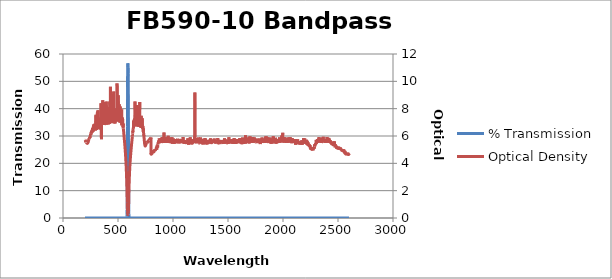
| Category | % Transmission |
|---|---|
| 2600.0 | 0.002 |
| 2599.0 | 0.002 |
| 2598.0 | 0.002 |
| 2597.0 | 0.002 |
| 2596.0 | 0.003 |
| 2595.0 | 0.002 |
| 2594.0 | 0.002 |
| 2593.0 | 0.002 |
| 2592.0 | 0.002 |
| 2591.0 | 0.002 |
| 2590.0 | 0.002 |
| 2589.0 | 0.002 |
| 2588.0 | 0.002 |
| 2587.0 | 0.003 |
| 2586.0 | 0.002 |
| 2585.0 | 0.002 |
| 2584.0 | 0.002 |
| 2583.0 | 0.002 |
| 2582.0 | 0.002 |
| 2581.0 | 0.002 |
| 2580.0 | 0.002 |
| 2579.0 | 0.002 |
| 2578.0 | 0.002 |
| 2577.0 | 0.002 |
| 2576.0 | 0.002 |
| 2575.0 | 0.002 |
| 2574.0 | 0.002 |
| 2573.0 | 0.002 |
| 2572.0 | 0.002 |
| 2571.0 | 0.002 |
| 2570.0 | 0.002 |
| 2569.0 | 0.002 |
| 2568.0 | 0.002 |
| 2567.0 | 0.002 |
| 2566.0 | 0.002 |
| 2565.0 | 0.002 |
| 2564.0 | 0.002 |
| 2563.0 | 0.001 |
| 2562.0 | 0.002 |
| 2561.0 | 0.001 |
| 2560.0 | 0.002 |
| 2559.0 | 0.002 |
| 2558.0 | 0.002 |
| 2557.0 | 0.001 |
| 2556.0 | 0.001 |
| 2555.0 | 0.001 |
| 2554.0 | 0.001 |
| 2553.0 | 0.002 |
| 2552.0 | 0.001 |
| 2551.0 | 0.001 |
| 2550.0 | 0.001 |
| 2549.0 | 0.001 |
| 2548.0 | 0.001 |
| 2547.0 | 0.001 |
| 2546.0 | 0.001 |
| 2545.0 | 0.001 |
| 2544.0 | 0.001 |
| 2543.0 | 0.001 |
| 2542.0 | 0.001 |
| 2541.0 | 0.001 |
| 2540.0 | 0.001 |
| 2539.0 | 0.001 |
| 2538.0 | 0.001 |
| 2537.0 | 0.001 |
| 2536.0 | 0.001 |
| 2535.0 | 0.001 |
| 2534.0 | 0.001 |
| 2533.0 | 0.001 |
| 2532.0 | 0.001 |
| 2531.0 | 0.001 |
| 2530.0 | 0.001 |
| 2529.0 | 0.001 |
| 2528.0 | 0.001 |
| 2527.0 | 0.001 |
| 2526.0 | 0.001 |
| 2525.0 | 0.001 |
| 2524.0 | 0.001 |
| 2523.0 | 0.001 |
| 2522.0 | 0.001 |
| 2521.0 | 0.001 |
| 2520.0 | 0.001 |
| 2519.0 | 0.001 |
| 2518.0 | 0.001 |
| 2517.0 | 0.001 |
| 2516.0 | 0.001 |
| 2515.0 | 0.001 |
| 2514.0 | 0.001 |
| 2513.0 | 0.001 |
| 2512.0 | 0.001 |
| 2511.0 | 0.001 |
| 2510.0 | 0.001 |
| 2509.0 | 0.001 |
| 2508.0 | 0.001 |
| 2507.0 | 0.001 |
| 2506.0 | 0.001 |
| 2505.0 | 0.001 |
| 2504.0 | 0.001 |
| 2503.0 | 0.001 |
| 2502.0 | 0.001 |
| 2501.0 | 0.001 |
| 2500.0 | 0.001 |
| 2499.0 | 0.001 |
| 2498.0 | 0.001 |
| 2497.0 | 0.001 |
| 2496.0 | 0.001 |
| 2495.0 | 0.001 |
| 2494.0 | 0.001 |
| 2493.0 | 0.001 |
| 2492.0 | 0.001 |
| 2491.0 | 0.001 |
| 2490.0 | 0.001 |
| 2489.0 | 0.001 |
| 2488.0 | 0.001 |
| 2487.0 | 0.001 |
| 2486.0 | 0.001 |
| 2485.0 | 0.001 |
| 2484.0 | 0.001 |
| 2483.0 | 0.001 |
| 2482.0 | 0.001 |
| 2481.0 | 0 |
| 2480.0 | 0 |
| 2479.0 | 0 |
| 2478.0 | 0.001 |
| 2477.0 | 0.001 |
| 2476.0 | 0 |
| 2475.0 | 0 |
| 2474.0 | 0.001 |
| 2473.0 | 0.001 |
| 2472.0 | 0 |
| 2471.0 | 0 |
| 2470.0 | 0.001 |
| 2469.0 | 0 |
| 2468.0 | 0 |
| 2467.0 | 0 |
| 2466.0 | 0.001 |
| 2465.0 | 0.001 |
| 2464.0 | 0 |
| 2463.0 | 0.001 |
| 2462.0 | 0 |
| 2461.0 | 0 |
| 2460.0 | 0 |
| 2459.0 | 0 |
| 2458.0 | 0 |
| 2457.0 | 0 |
| 2456.0 | 0 |
| 2455.0 | 0 |
| 2454.0 | 0 |
| 2453.0 | 0 |
| 2452.0 | 0 |
| 2451.0 | 0 |
| 2450.0 | 0 |
| 2449.0 | 0 |
| 2448.0 | 0 |
| 2447.0 | 0 |
| 2446.0 | 0 |
| 2445.0 | 0 |
| 2444.0 | 0 |
| 2443.0 | 0 |
| 2442.0 | 0 |
| 2441.0 | 0 |
| 2440.0 | 0 |
| 2439.0 | 0 |
| 2438.0 | 0 |
| 2437.0 | 0 |
| 2436.0 | 0 |
| 2435.0 | 0 |
| 2434.0 | 0 |
| 2433.0 | 0 |
| 2432.0 | 0 |
| 2431.0 | 0 |
| 2430.0 | 0 |
| 2429.0 | 0 |
| 2428.0 | 0 |
| 2427.0 | 0 |
| 2426.0 | 0 |
| 2425.0 | 0 |
| 2424.0 | 0 |
| 2423.0 | 0 |
| 2422.0 | 0 |
| 2421.0 | 0 |
| 2420.0 | 0 |
| 2419.0 | 0 |
| 2418.0 | 0 |
| 2417.0 | 0 |
| 2416.0 | 0 |
| 2415.0 | 0 |
| 2414.0 | 0 |
| 2413.0 | 0 |
| 2412.0 | 0 |
| 2411.0 | 0 |
| 2410.0 | 0 |
| 2409.0 | 0 |
| 2408.0 | 0 |
| 2407.0 | 0 |
| 2406.0 | 0 |
| 2405.0 | 0 |
| 2404.0 | 0 |
| 2403.0 | 0 |
| 2402.0 | 0 |
| 2401.0 | 0 |
| 2400.0 | 0 |
| 2399.0 | 0 |
| 2398.0 | 0 |
| 2397.0 | 0 |
| 2396.0 | 0 |
| 2395.0 | 0 |
| 2394.0 | 0 |
| 2393.0 | 0 |
| 2392.0 | 0 |
| 2391.0 | 0 |
| 2390.0 | 0 |
| 2389.0 | 0 |
| 2388.0 | 0 |
| 2387.0 | 0 |
| 2386.0 | 0 |
| 2385.0 | 0 |
| 2384.0 | 0 |
| 2383.0 | 0 |
| 2382.0 | 0 |
| 2381.0 | 0 |
| 2380.0 | 0 |
| 2379.0 | 0 |
| 2378.0 | 0 |
| 2377.0 | 0 |
| 2376.0 | 0 |
| 2375.0 | 0 |
| 2374.0 | 0 |
| 2373.0 | 0 |
| 2372.0 | 0 |
| 2371.0 | 0 |
| 2370.0 | 0 |
| 2369.0 | 0 |
| 2368.0 | 0 |
| 2367.0 | 0 |
| 2366.0 | 0 |
| 2365.0 | 0 |
| 2364.0 | 0 |
| 2363.0 | 0 |
| 2362.0 | 0 |
| 2361.0 | 0 |
| 2360.0 | 0 |
| 2359.0 | 0 |
| 2358.0 | 0 |
| 2357.0 | 0 |
| 2356.0 | 0 |
| 2355.0 | 0 |
| 2354.0 | 0 |
| 2353.0 | 0 |
| 2352.0 | 0 |
| 2351.0 | 0 |
| 2350.0 | 0 |
| 2349.0 | 0 |
| 2348.0 | 0 |
| 2347.0 | 0 |
| 2346.0 | 0 |
| 2345.0 | 0 |
| 2344.0 | 0 |
| 2343.0 | 0 |
| 2342.0 | 0 |
| 2341.0 | 0 |
| 2340.0 | 0 |
| 2339.0 | 0 |
| 2338.0 | 0 |
| 2337.0 | 0 |
| 2336.0 | 0 |
| 2335.0 | 0 |
| 2334.0 | 0 |
| 2333.0 | 0 |
| 2332.0 | 0 |
| 2331.0 | 0 |
| 2330.0 | 0 |
| 2329.0 | 0 |
| 2328.0 | 0 |
| 2327.0 | 0 |
| 2326.0 | 0 |
| 2325.0 | 0 |
| 2324.0 | 0 |
| 2323.0 | 0 |
| 2322.0 | 0 |
| 2321.0 | 0 |
| 2320.0 | 0 |
| 2319.0 | 0 |
| 2318.0 | 0 |
| 2317.0 | 0 |
| 2316.0 | 0 |
| 2315.0 | 0 |
| 2314.0 | 0 |
| 2313.0 | 0 |
| 2312.0 | 0 |
| 2311.0 | 0 |
| 2310.0 | 0 |
| 2309.0 | 0 |
| 2308.0 | 0 |
| 2307.0 | 0 |
| 2306.0 | 0 |
| 2305.0 | 0 |
| 2304.0 | 0 |
| 2303.0 | 0 |
| 2302.0 | 0 |
| 2301.0 | 0 |
| 2300.0 | 0 |
| 2299.0 | 0 |
| 2298.0 | 0 |
| 2297.0 | 0 |
| 2296.0 | 0 |
| 2295.0 | 0 |
| 2294.0 | 0 |
| 2293.0 | 0 |
| 2292.0 | 0 |
| 2291.0 | 0.001 |
| 2290.0 | 0.001 |
| 2289.0 | 0.001 |
| 2288.0 | 0 |
| 2287.0 | 0 |
| 2286.0 | 0.001 |
| 2285.0 | 0.001 |
| 2284.0 | 0.001 |
| 2283.0 | 0.001 |
| 2282.0 | 0.001 |
| 2281.0 | 0.001 |
| 2280.0 | 0.001 |
| 2279.0 | 0.001 |
| 2278.0 | 0.001 |
| 2277.0 | 0.001 |
| 2276.0 | 0.001 |
| 2275.0 | 0.001 |
| 2274.0 | 0.001 |
| 2273.0 | 0.001 |
| 2272.0 | 0.001 |
| 2271.0 | 0.001 |
| 2270.0 | 0.001 |
| 2269.0 | 0.001 |
| 2268.0 | 0.001 |
| 2267.0 | 0.001 |
| 2266.0 | 0.001 |
| 2265.0 | 0.001 |
| 2264.0 | 0.001 |
| 2263.0 | 0.001 |
| 2262.0 | 0.001 |
| 2261.0 | 0.001 |
| 2260.0 | 0.001 |
| 2259.0 | 0.001 |
| 2258.0 | 0.001 |
| 2257.0 | 0.001 |
| 2256.0 | 0.001 |
| 2255.0 | 0.001 |
| 2254.0 | 0.001 |
| 2253.0 | 0.001 |
| 2252.0 | 0.001 |
| 2251.0 | 0.001 |
| 2250.0 | 0.001 |
| 2249.0 | 0.001 |
| 2248.0 | 0.001 |
| 2247.0 | 0.001 |
| 2246.0 | 0 |
| 2245.0 | 0.001 |
| 2244.0 | 0.001 |
| 2243.0 | 0 |
| 2242.0 | 0.001 |
| 2241.0 | 0.001 |
| 2240.0 | 0 |
| 2239.0 | 0.001 |
| 2238.0 | 0 |
| 2237.0 | 0 |
| 2236.0 | 0 |
| 2235.0 | 0 |
| 2234.0 | 0 |
| 2233.0 | 0 |
| 2232.0 | 0 |
| 2231.0 | 0 |
| 2230.0 | 0 |
| 2229.0 | 0 |
| 2228.0 | 0 |
| 2227.0 | 0 |
| 2226.0 | 0 |
| 2225.0 | 0 |
| 2224.0 | 0 |
| 2223.0 | 0 |
| 2222.0 | 0 |
| 2221.0 | 0 |
| 2220.0 | 0 |
| 2219.0 | 0 |
| 2218.0 | 0 |
| 2217.0 | 0 |
| 2216.0 | 0 |
| 2215.0 | 0 |
| 2214.0 | 0 |
| 2213.0 | 0 |
| 2212.0 | 0 |
| 2211.0 | 0 |
| 2210.0 | 0 |
| 2209.0 | 0 |
| 2208.0 | 0 |
| 2207.0 | 0 |
| 2206.0 | 0 |
| 2205.0 | 0 |
| 2204.0 | 0 |
| 2203.0 | 0 |
| 2202.0 | 0 |
| 2201.0 | 0 |
| 2200.0 | 0 |
| 2199.0 | 0 |
| 2198.0 | 0 |
| 2197.0 | 0 |
| 2196.0 | 0 |
| 2195.0 | 0 |
| 2194.0 | 0 |
| 2193.0 | 0 |
| 2192.0 | 0 |
| 2191.0 | 0 |
| 2190.0 | 0 |
| 2189.0 | 0 |
| 2188.0 | 0 |
| 2187.0 | 0 |
| 2186.0 | 0 |
| 2185.0 | 0 |
| 2184.0 | 0 |
| 2183.0 | 0 |
| 2182.0 | 0 |
| 2181.0 | 0 |
| 2180.0 | 0 |
| 2179.0 | 0 |
| 2178.0 | 0 |
| 2177.0 | 0 |
| 2176.0 | 0 |
| 2175.0 | 0 |
| 2174.0 | 0 |
| 2173.0 | 0 |
| 2172.0 | 0 |
| 2171.0 | 0 |
| 2170.0 | 0 |
| 2169.0 | 0 |
| 2168.0 | 0 |
| 2167.0 | 0 |
| 2166.0 | 0 |
| 2165.0 | 0 |
| 2164.0 | 0 |
| 2163.0 | 0 |
| 2162.0 | 0 |
| 2161.0 | 0 |
| 2160.0 | 0 |
| 2159.0 | 0 |
| 2158.0 | 0 |
| 2157.0 | 0 |
| 2156.0 | 0 |
| 2155.0 | 0 |
| 2154.0 | 0 |
| 2153.0 | 0 |
| 2152.0 | 0 |
| 2151.0 | 0 |
| 2150.0 | 0 |
| 2149.0 | 0 |
| 2148.0 | 0 |
| 2147.0 | 0 |
| 2146.0 | 0 |
| 2145.0 | 0 |
| 2144.0 | 0 |
| 2143.0 | 0 |
| 2142.0 | 0 |
| 2141.0 | 0 |
| 2140.0 | 0 |
| 2139.0 | 0 |
| 2138.0 | 0 |
| 2137.0 | 0 |
| 2136.0 | 0 |
| 2135.0 | 0 |
| 2134.0 | 0 |
| 2133.0 | 0 |
| 2132.0 | 0 |
| 2131.0 | 0 |
| 2130.0 | 0 |
| 2129.0 | 0 |
| 2128.0 | 0 |
| 2127.0 | 0 |
| 2126.0 | 0 |
| 2125.0 | 0 |
| 2124.0 | 0 |
| 2123.0 | 0 |
| 2122.0 | 0 |
| 2121.0 | 0 |
| 2120.0 | 0 |
| 2119.0 | 0 |
| 2118.0 | 0 |
| 2117.0 | 0 |
| 2116.0 | 0 |
| 2115.0 | 0 |
| 2114.0 | 0 |
| 2113.0 | 0 |
| 2112.0 | 0 |
| 2111.0 | 0 |
| 2110.0 | 0 |
| 2109.0 | 0 |
| 2108.0 | 0 |
| 2107.0 | 0 |
| 2106.0 | 0 |
| 2105.0 | 0 |
| 2104.0 | 0 |
| 2103.0 | 0 |
| 2102.0 | 0 |
| 2101.0 | 0 |
| 2100.0 | 0 |
| 2099.0 | 0 |
| 2098.0 | 0 |
| 2097.0 | 0 |
| 2096.0 | 0 |
| 2095.0 | 0 |
| 2094.0 | 0 |
| 2093.0 | 0 |
| 2092.0 | 0 |
| 2091.0 | 0 |
| 2090.0 | 0 |
| 2089.0 | 0 |
| 2088.0 | 0 |
| 2087.0 | 0 |
| 2086.0 | 0 |
| 2085.0 | 0 |
| 2084.0 | 0 |
| 2083.0 | 0 |
| 2082.0 | 0 |
| 2081.0 | 0 |
| 2080.0 | 0 |
| 2079.0 | 0 |
| 2078.0 | 0 |
| 2077.0 | 0 |
| 2076.0 | 0 |
| 2075.0 | 0 |
| 2074.0 | 0 |
| 2073.0 | 0 |
| 2072.0 | 0 |
| 2071.0 | 0 |
| 2070.0 | 0 |
| 2069.0 | 0 |
| 2068.0 | 0 |
| 2067.0 | 0 |
| 2066.0 | 0 |
| 2065.0 | 0 |
| 2064.0 | 0 |
| 2063.0 | 0 |
| 2062.0 | 0 |
| 2061.0 | 0 |
| 2060.0 | 0 |
| 2059.0 | 0 |
| 2058.0 | 0 |
| 2057.0 | 0 |
| 2056.0 | 0 |
| 2055.0 | 0 |
| 2054.0 | 0 |
| 2053.0 | 0 |
| 2052.0 | 0 |
| 2051.0 | 0 |
| 2050.0 | 0 |
| 2049.0 | 0 |
| 2048.0 | 0 |
| 2047.0 | 0 |
| 2046.0 | 0 |
| 2045.0 | 0 |
| 2044.0 | 0 |
| 2043.0 | 0 |
| 2042.0 | 0 |
| 2041.0 | 0 |
| 2040.0 | 0 |
| 2039.0 | 0 |
| 2038.0 | 0 |
| 2037.0 | 0 |
| 2036.0 | 0 |
| 2035.0 | 0 |
| 2034.0 | 0 |
| 2033.0 | 0 |
| 2032.0 | 0 |
| 2031.0 | 0 |
| 2030.0 | 0 |
| 2029.0 | 0 |
| 2028.0 | 0 |
| 2027.0 | 0 |
| 2026.0 | 0 |
| 2025.0 | 0 |
| 2024.0 | 0 |
| 2023.0 | 0 |
| 2022.0 | 0 |
| 2021.0 | 0 |
| 2020.0 | 0 |
| 2019.0 | 0 |
| 2018.0 | 0 |
| 2017.0 | 0 |
| 2016.0 | 0 |
| 2015.0 | 0 |
| 2014.0 | 0 |
| 2013.0 | 0 |
| 2012.0 | 0 |
| 2011.0 | 0 |
| 2010.0 | 0 |
| 2009.0 | 0 |
| 2008.0 | 0 |
| 2007.0 | 0 |
| 2006.0 | 0 |
| 2005.0 | 0 |
| 2004.0 | 0 |
| 2003.0 | 0 |
| 2002.0 | 0 |
| 2001.0 | 0 |
| 2000.0 | 0 |
| 1999.0 | 0 |
| 1998.0 | 0 |
| 1997.0 | 0 |
| 1996.0 | 0 |
| 1995.0 | 0 |
| 1994.0 | 0 |
| 1993.0 | 0 |
| 1992.0 | 0 |
| 1991.0 | 0 |
| 1990.0 | 0 |
| 1989.0 | 0 |
| 1988.0 | 0 |
| 1987.0 | 0 |
| 1986.0 | 0 |
| 1985.0 | 0 |
| 1984.0 | 0 |
| 1983.0 | 0 |
| 1982.0 | 0 |
| 1981.0 | 0 |
| 1980.0 | 0 |
| 1979.0 | 0 |
| 1978.0 | 0 |
| 1977.0 | 0 |
| 1976.0 | 0 |
| 1975.0 | 0 |
| 1974.0 | 0 |
| 1973.0 | 0 |
| 1972.0 | 0 |
| 1971.0 | 0 |
| 1970.0 | 0 |
| 1969.0 | 0 |
| 1968.0 | 0 |
| 1967.0 | 0 |
| 1966.0 | 0 |
| 1965.0 | 0 |
| 1964.0 | 0 |
| 1963.0 | 0 |
| 1962.0 | 0 |
| 1961.0 | 0 |
| 1960.0 | 0 |
| 1959.0 | 0 |
| 1958.0 | 0 |
| 1957.0 | 0 |
| 1956.0 | 0 |
| 1955.0 | 0 |
| 1954.0 | 0 |
| 1953.0 | 0 |
| 1952.0 | 0 |
| 1951.0 | 0 |
| 1950.0 | 0 |
| 1949.0 | 0 |
| 1948.0 | 0 |
| 1947.0 | 0 |
| 1946.0 | 0 |
| 1945.0 | 0 |
| 1944.0 | 0 |
| 1943.0 | 0 |
| 1942.0 | 0 |
| 1941.0 | 0 |
| 1940.0 | 0 |
| 1939.0 | 0 |
| 1938.0 | 0 |
| 1937.0 | 0 |
| 1936.0 | 0 |
| 1935.0 | 0 |
| 1934.0 | 0 |
| 1933.0 | 0 |
| 1932.0 | 0 |
| 1931.0 | 0 |
| 1930.0 | 0 |
| 1929.0 | 0 |
| 1928.0 | 0 |
| 1927.0 | 0 |
| 1926.0 | 0 |
| 1925.0 | 0 |
| 1924.0 | 0 |
| 1923.0 | 0 |
| 1922.0 | 0 |
| 1921.0 | 0 |
| 1920.0 | 0 |
| 1919.0 | 0 |
| 1918.0 | 0 |
| 1917.0 | 0 |
| 1916.0 | 0 |
| 1915.0 | 0 |
| 1914.0 | 0 |
| 1913.0 | 0 |
| 1912.0 | 0 |
| 1911.0 | 0 |
| 1910.0 | 0 |
| 1909.0 | 0 |
| 1908.0 | 0 |
| 1907.0 | 0 |
| 1906.0 | 0 |
| 1905.0 | 0 |
| 1904.0 | 0 |
| 1903.0 | 0 |
| 1902.0 | 0 |
| 1901.0 | 0 |
| 1900.0 | 0 |
| 1899.0 | 0 |
| 1898.0 | 0 |
| 1897.0 | 0 |
| 1896.0 | 0 |
| 1895.0 | 0 |
| 1894.0 | 0 |
| 1893.0 | 0 |
| 1892.0 | 0 |
| 1891.0 | 0 |
| 1890.0 | 0 |
| 1889.0 | 0 |
| 1888.0 | 0 |
| 1887.0 | 0 |
| 1886.0 | 0 |
| 1885.0 | 0 |
| 1884.0 | 0 |
| 1883.0 | 0 |
| 1882.0 | 0 |
| 1881.0 | 0 |
| 1880.0 | 0 |
| 1879.0 | 0 |
| 1878.0 | 0 |
| 1877.0 | 0 |
| 1876.0 | 0 |
| 1875.0 | 0 |
| 1874.0 | 0 |
| 1873.0 | 0 |
| 1872.0 | 0 |
| 1871.0 | 0 |
| 1870.0 | 0 |
| 1869.0 | 0 |
| 1868.0 | 0 |
| 1867.0 | 0 |
| 1866.0 | 0 |
| 1865.0 | 0 |
| 1864.0 | 0 |
| 1863.0 | 0 |
| 1862.0 | 0 |
| 1861.0 | 0 |
| 1860.0 | 0 |
| 1859.0 | 0 |
| 1858.0 | 0 |
| 1857.0 | 0 |
| 1856.0 | 0 |
| 1855.0 | 0 |
| 1854.0 | 0 |
| 1853.0 | 0 |
| 1852.0 | 0 |
| 1851.0 | 0 |
| 1850.0 | 0 |
| 1849.0 | 0 |
| 1848.0 | 0 |
| 1847.0 | 0 |
| 1846.0 | 0 |
| 1845.0 | 0 |
| 1844.0 | 0 |
| 1843.0 | 0 |
| 1842.0 | 0 |
| 1841.0 | 0 |
| 1840.0 | 0 |
| 1839.0 | 0 |
| 1838.0 | 0 |
| 1837.0 | 0 |
| 1836.0 | 0 |
| 1835.0 | 0 |
| 1834.0 | 0 |
| 1833.0 | 0 |
| 1832.0 | 0 |
| 1831.0 | 0 |
| 1830.0 | 0 |
| 1829.0 | 0 |
| 1828.0 | 0 |
| 1827.0 | 0 |
| 1826.0 | 0 |
| 1825.0 | 0 |
| 1824.0 | 0 |
| 1823.0 | 0 |
| 1822.0 | 0 |
| 1821.0 | 0 |
| 1820.0 | 0 |
| 1819.0 | 0 |
| 1818.0 | 0 |
| 1817.0 | 0 |
| 1816.0 | 0 |
| 1815.0 | 0 |
| 1814.0 | 0 |
| 1813.0 | 0 |
| 1812.0 | 0 |
| 1811.0 | 0 |
| 1810.0 | 0 |
| 1809.0 | 0 |
| 1808.0 | 0 |
| 1807.0 | 0 |
| 1806.0 | 0 |
| 1805.0 | 0 |
| 1804.0 | 0 |
| 1803.0 | 0 |
| 1802.0 | 0 |
| 1801.0 | 0 |
| 1800.0 | 0 |
| 1799.0 | 0 |
| 1798.0 | 0 |
| 1797.0 | 0 |
| 1796.0 | 0 |
| 1795.0 | 0 |
| 1794.0 | 0 |
| 1793.0 | 0 |
| 1792.0 | 0 |
| 1791.0 | 0 |
| 1790.0 | 0 |
| 1789.0 | 0 |
| 1788.0 | 0 |
| 1787.0 | 0 |
| 1786.0 | 0 |
| 1785.0 | 0 |
| 1784.0 | 0 |
| 1783.0 | 0 |
| 1782.0 | 0 |
| 1781.0 | 0 |
| 1780.0 | 0 |
| 1779.0 | 0 |
| 1778.0 | 0 |
| 1777.0 | 0 |
| 1776.0 | 0 |
| 1775.0 | 0 |
| 1774.0 | 0 |
| 1773.0 | 0 |
| 1772.0 | 0 |
| 1771.0 | 0 |
| 1770.0 | 0 |
| 1769.0 | 0 |
| 1768.0 | 0 |
| 1767.0 | 0 |
| 1766.0 | 0 |
| 1765.0 | 0 |
| 1764.0 | 0 |
| 1763.0 | 0 |
| 1762.0 | 0 |
| 1761.0 | 0 |
| 1760.0 | 0 |
| 1759.0 | 0 |
| 1758.0 | 0 |
| 1757.0 | 0 |
| 1756.0 | 0 |
| 1755.0 | 0 |
| 1754.0 | 0 |
| 1753.0 | 0 |
| 1752.0 | 0 |
| 1751.0 | 0 |
| 1750.0 | 0 |
| 1749.0 | 0 |
| 1748.0 | 0 |
| 1747.0 | 0 |
| 1746.0 | 0 |
| 1745.0 | 0 |
| 1744.0 | 0 |
| 1743.0 | 0 |
| 1742.0 | 0 |
| 1741.0 | 0 |
| 1740.0 | 0 |
| 1739.0 | 0 |
| 1738.0 | 0 |
| 1737.0 | 0 |
| 1736.0 | 0 |
| 1735.0 | 0 |
| 1734.0 | 0 |
| 1733.0 | 0 |
| 1732.0 | 0 |
| 1731.0 | 0 |
| 1730.0 | 0 |
| 1729.0 | 0 |
| 1728.0 | 0 |
| 1727.0 | 0 |
| 1726.0 | 0 |
| 1725.0 | 0 |
| 1724.0 | 0 |
| 1723.0 | 0 |
| 1722.0 | 0 |
| 1721.0 | 0 |
| 1720.0 | 0 |
| 1719.0 | 0 |
| 1718.0 | 0 |
| 1717.0 | 0 |
| 1716.0 | 0 |
| 1715.0 | 0 |
| 1714.0 | 0 |
| 1713.0 | 0 |
| 1712.0 | 0 |
| 1711.0 | 0 |
| 1710.0 | 0 |
| 1709.0 | 0 |
| 1708.0 | 0 |
| 1707.0 | 0 |
| 1706.0 | 0 |
| 1705.0 | 0 |
| 1704.0 | 0 |
| 1703.0 | 0 |
| 1702.0 | 0 |
| 1701.0 | 0 |
| 1700.0 | 0 |
| 1699.0 | 0 |
| 1698.0 | 0 |
| 1697.0 | 0 |
| 1696.0 | 0 |
| 1695.0 | 0 |
| 1694.0 | 0 |
| 1693.0 | 0 |
| 1692.0 | 0 |
| 1691.0 | 0 |
| 1690.0 | 0 |
| 1689.0 | 0 |
| 1688.0 | 0 |
| 1687.0 | 0 |
| 1686.0 | 0 |
| 1685.0 | 0 |
| 1684.0 | 0 |
| 1683.0 | 0 |
| 1682.0 | 0 |
| 1681.0 | 0 |
| 1680.0 | 0 |
| 1679.0 | 0 |
| 1678.0 | 0 |
| 1677.0 | 0 |
| 1676.0 | 0 |
| 1675.0 | 0 |
| 1674.0 | 0 |
| 1673.0 | 0 |
| 1672.0 | 0 |
| 1671.0 | 0 |
| 1670.0 | 0 |
| 1669.0 | 0 |
| 1668.0 | 0 |
| 1667.0 | 0 |
| 1666.0 | 0 |
| 1665.0 | 0 |
| 1664.0 | 0 |
| 1663.0 | 0 |
| 1662.0 | 0 |
| 1661.0 | 0 |
| 1660.0 | 0 |
| 1659.0 | 0 |
| 1658.0 | 0 |
| 1657.0 | 0 |
| 1656.0 | 0 |
| 1655.0 | 0 |
| 1654.0 | 0 |
| 1653.0 | 0 |
| 1652.0 | 0 |
| 1651.0 | 0 |
| 1650.0 | 0 |
| 1649.0 | 0 |
| 1648.0 | 0 |
| 1647.0 | 0 |
| 1646.0 | 0 |
| 1645.0 | 0 |
| 1644.0 | 0 |
| 1643.0 | 0 |
| 1642.0 | 0 |
| 1641.0 | 0 |
| 1640.0 | 0 |
| 1639.0 | 0 |
| 1638.0 | 0 |
| 1637.0 | 0 |
| 1636.0 | 0 |
| 1635.0 | 0 |
| 1634.0 | 0 |
| 1633.0 | 0 |
| 1632.0 | 0 |
| 1631.0 | 0 |
| 1630.0 | 0 |
| 1629.0 | 0 |
| 1628.0 | 0 |
| 1627.0 | 0 |
| 1626.0 | 0 |
| 1625.0 | 0 |
| 1624.0 | 0 |
| 1623.0 | 0 |
| 1622.0 | 0 |
| 1621.0 | 0 |
| 1620.0 | 0 |
| 1619.0 | 0 |
| 1618.0 | 0 |
| 1617.0 | 0 |
| 1616.0 | 0 |
| 1615.0 | 0 |
| 1614.0 | 0 |
| 1613.0 | 0 |
| 1612.0 | 0 |
| 1611.0 | 0 |
| 1610.0 | 0 |
| 1609.0 | 0 |
| 1608.0 | 0 |
| 1607.0 | 0 |
| 1606.0 | 0 |
| 1605.0 | 0 |
| 1604.0 | 0 |
| 1603.0 | 0 |
| 1602.0 | 0 |
| 1601.0 | 0 |
| 1600.0 | 0 |
| 1599.0 | 0 |
| 1598.0 | 0 |
| 1597.0 | 0 |
| 1596.0 | 0 |
| 1595.0 | 0 |
| 1594.0 | 0 |
| 1593.0 | 0 |
| 1592.0 | 0 |
| 1591.0 | 0 |
| 1590.0 | 0 |
| 1589.0 | 0 |
| 1588.0 | 0 |
| 1587.0 | 0 |
| 1586.0 | 0 |
| 1585.0 | 0 |
| 1584.0 | 0 |
| 1583.0 | 0 |
| 1582.0 | 0 |
| 1581.0 | 0 |
| 1580.0 | 0 |
| 1579.0 | 0 |
| 1578.0 | 0 |
| 1577.0 | 0 |
| 1576.0 | 0 |
| 1575.0 | 0 |
| 1574.0 | 0 |
| 1573.0 | 0 |
| 1572.0 | 0 |
| 1571.0 | 0 |
| 1570.0 | 0 |
| 1569.0 | 0 |
| 1568.0 | 0 |
| 1567.0 | 0 |
| 1566.0 | 0 |
| 1565.0 | 0 |
| 1564.0 | 0 |
| 1563.0 | 0 |
| 1562.0 | 0 |
| 1561.0 | 0 |
| 1560.0 | 0 |
| 1559.0 | 0 |
| 1558.0 | 0 |
| 1557.0 | 0 |
| 1556.0 | 0 |
| 1555.0 | 0 |
| 1554.0 | 0 |
| 1553.0 | 0 |
| 1552.0 | 0 |
| 1551.0 | 0 |
| 1550.0 | 0 |
| 1549.0 | 0 |
| 1548.0 | 0 |
| 1547.0 | 0 |
| 1546.0 | 0 |
| 1545.0 | 0 |
| 1544.0 | 0 |
| 1543.0 | 0 |
| 1542.0 | 0 |
| 1541.0 | 0 |
| 1540.0 | 0 |
| 1539.0 | 0 |
| 1538.0 | 0 |
| 1537.0 | 0 |
| 1536.0 | 0 |
| 1535.0 | 0 |
| 1534.0 | 0 |
| 1533.0 | 0 |
| 1532.0 | 0 |
| 1531.0 | 0 |
| 1530.0 | 0 |
| 1529.0 | 0 |
| 1528.0 | 0 |
| 1527.0 | 0 |
| 1526.0 | 0 |
| 1525.0 | 0 |
| 1524.0 | 0 |
| 1523.0 | 0 |
| 1522.0 | 0 |
| 1521.0 | 0 |
| 1520.0 | 0 |
| 1519.0 | 0 |
| 1518.0 | 0 |
| 1517.0 | 0 |
| 1516.0 | 0 |
| 1515.0 | 0 |
| 1514.0 | 0 |
| 1513.0 | 0 |
| 1512.0 | 0 |
| 1511.0 | 0 |
| 1510.0 | 0 |
| 1509.0 | 0 |
| 1508.0 | 0 |
| 1507.0 | 0 |
| 1506.0 | 0 |
| 1505.0 | 0 |
| 1504.0 | 0 |
| 1503.0 | 0 |
| 1502.0 | 0 |
| 1501.0 | 0 |
| 1500.0 | 0 |
| 1499.0 | 0 |
| 1498.0 | 0 |
| 1497.0 | 0 |
| 1496.0 | 0 |
| 1495.0 | 0 |
| 1494.0 | 0 |
| 1493.0 | 0 |
| 1492.0 | 0 |
| 1491.0 | 0 |
| 1490.0 | 0 |
| 1489.0 | 0 |
| 1488.0 | 0 |
| 1487.0 | 0 |
| 1486.0 | 0 |
| 1485.0 | 0 |
| 1484.0 | 0 |
| 1483.0 | 0 |
| 1482.0 | 0 |
| 1481.0 | 0 |
| 1480.0 | 0 |
| 1479.0 | 0 |
| 1478.0 | 0 |
| 1477.0 | 0 |
| 1476.0 | 0 |
| 1475.0 | 0 |
| 1474.0 | 0 |
| 1473.0 | 0 |
| 1472.0 | 0 |
| 1471.0 | 0 |
| 1470.0 | 0 |
| 1469.0 | 0 |
| 1468.0 | 0 |
| 1467.0 | 0 |
| 1466.0 | 0 |
| 1465.0 | 0 |
| 1464.0 | 0 |
| 1463.0 | 0 |
| 1462.0 | 0 |
| 1461.0 | 0 |
| 1460.0 | 0 |
| 1459.0 | 0 |
| 1458.0 | 0 |
| 1457.0 | 0 |
| 1456.0 | 0 |
| 1455.0 | 0 |
| 1454.0 | 0 |
| 1453.0 | 0 |
| 1452.0 | 0 |
| 1451.0 | 0 |
| 1450.0 | 0 |
| 1449.0 | 0 |
| 1448.0 | 0 |
| 1447.0 | 0 |
| 1446.0 | 0 |
| 1445.0 | 0 |
| 1444.0 | 0 |
| 1443.0 | 0 |
| 1442.0 | 0 |
| 1441.0 | 0 |
| 1440.0 | 0 |
| 1439.0 | 0 |
| 1438.0 | 0 |
| 1437.0 | 0 |
| 1436.0 | 0 |
| 1435.0 | 0 |
| 1434.0 | 0 |
| 1433.0 | 0 |
| 1432.0 | 0 |
| 1431.0 | 0 |
| 1430.0 | 0 |
| 1429.0 | 0 |
| 1428.0 | 0 |
| 1427.0 | 0 |
| 1426.0 | 0 |
| 1425.0 | 0 |
| 1424.0 | 0 |
| 1423.0 | 0 |
| 1422.0 | 0 |
| 1421.0 | 0 |
| 1420.0 | 0 |
| 1419.0 | 0 |
| 1418.0 | 0 |
| 1417.0 | 0 |
| 1416.0 | 0 |
| 1415.0 | 0 |
| 1414.0 | 0 |
| 1413.0 | 0 |
| 1412.0 | 0 |
| 1411.0 | 0 |
| 1410.0 | 0 |
| 1409.0 | 0 |
| 1408.0 | 0 |
| 1407.0 | 0 |
| 1406.0 | 0 |
| 1405.0 | 0 |
| 1404.0 | 0 |
| 1403.0 | 0 |
| 1402.0 | 0 |
| 1401.0 | 0 |
| 1400.0 | 0 |
| 1399.0 | 0 |
| 1398.0 | 0 |
| 1397.0 | 0 |
| 1396.0 | 0 |
| 1395.0 | 0 |
| 1394.0 | 0 |
| 1393.0 | 0 |
| 1392.0 | 0 |
| 1391.0 | 0 |
| 1390.0 | 0 |
| 1389.0 | 0 |
| 1388.0 | 0 |
| 1387.0 | 0 |
| 1386.0 | 0 |
| 1385.0 | 0 |
| 1384.0 | 0 |
| 1383.0 | 0 |
| 1382.0 | 0 |
| 1381.0 | 0 |
| 1380.0 | 0 |
| 1379.0 | 0 |
| 1378.0 | 0 |
| 1377.0 | 0 |
| 1376.0 | 0 |
| 1375.0 | 0 |
| 1374.0 | 0 |
| 1373.0 | 0 |
| 1372.0 | 0 |
| 1371.0 | 0 |
| 1370.0 | 0 |
| 1369.0 | 0 |
| 1368.0 | 0 |
| 1367.0 | 0 |
| 1366.0 | 0 |
| 1365.0 | 0 |
| 1364.0 | 0 |
| 1363.0 | 0 |
| 1362.0 | 0 |
| 1361.0 | 0 |
| 1360.0 | 0 |
| 1359.0 | 0 |
| 1358.0 | 0 |
| 1357.0 | 0 |
| 1356.0 | 0 |
| 1355.0 | 0 |
| 1354.0 | 0 |
| 1353.0 | 0 |
| 1352.0 | 0 |
| 1351.0 | 0 |
| 1350.0 | 0 |
| 1349.0 | 0 |
| 1348.0 | 0 |
| 1347.0 | 0 |
| 1346.0 | 0 |
| 1345.0 | 0 |
| 1344.0 | 0 |
| 1343.0 | 0 |
| 1342.0 | 0 |
| 1341.0 | 0 |
| 1340.0 | 0 |
| 1339.0 | 0 |
| 1338.0 | 0 |
| 1337.0 | 0 |
| 1336.0 | 0 |
| 1335.0 | 0 |
| 1334.0 | 0 |
| 1333.0 | 0 |
| 1332.0 | 0 |
| 1331.0 | 0 |
| 1330.0 | 0 |
| 1329.0 | 0 |
| 1328.0 | 0 |
| 1327.0 | 0 |
| 1326.0 | 0 |
| 1325.0 | 0 |
| 1324.0 | 0 |
| 1323.0 | 0 |
| 1322.0 | 0 |
| 1321.0 | 0 |
| 1320.0 | 0 |
| 1319.0 | 0 |
| 1318.0 | 0 |
| 1317.0 | 0 |
| 1316.0 | 0 |
| 1315.0 | 0 |
| 1314.0 | 0 |
| 1313.0 | 0 |
| 1312.0 | 0 |
| 1311.0 | 0 |
| 1310.0 | 0 |
| 1309.0 | 0 |
| 1308.0 | 0 |
| 1307.0 | 0 |
| 1306.0 | 0 |
| 1305.0 | 0 |
| 1304.0 | 0 |
| 1303.0 | 0 |
| 1302.0 | 0 |
| 1301.0 | 0 |
| 1300.0 | 0 |
| 1299.0 | 0 |
| 1298.0 | 0 |
| 1297.0 | 0 |
| 1296.0 | 0 |
| 1295.0 | 0 |
| 1294.0 | 0 |
| 1293.0 | 0 |
| 1292.0 | 0 |
| 1291.0 | 0 |
| 1290.0 | 0 |
| 1289.0 | 0 |
| 1288.0 | 0 |
| 1287.0 | 0 |
| 1286.0 | 0 |
| 1285.0 | 0 |
| 1284.0 | 0 |
| 1283.0 | 0 |
| 1282.0 | 0 |
| 1281.0 | 0 |
| 1280.0 | 0 |
| 1279.0 | 0 |
| 1278.0 | 0 |
| 1277.0 | 0 |
| 1276.0 | 0 |
| 1275.0 | 0 |
| 1274.0 | 0 |
| 1273.0 | 0 |
| 1272.0 | 0 |
| 1271.0 | 0 |
| 1270.0 | 0 |
| 1269.0 | 0 |
| 1268.0 | 0 |
| 1267.0 | 0 |
| 1266.0 | 0 |
| 1265.0 | 0 |
| 1264.0 | 0 |
| 1263.0 | 0 |
| 1262.0 | 0 |
| 1261.0 | 0 |
| 1260.0 | 0 |
| 1259.0 | 0 |
| 1258.0 | 0 |
| 1257.0 | 0 |
| 1256.0 | 0 |
| 1255.0 | 0 |
| 1254.0 | 0 |
| 1253.0 | 0 |
| 1252.0 | 0 |
| 1251.0 | 0 |
| 1250.0 | 0 |
| 1249.0 | 0 |
| 1248.0 | 0 |
| 1247.0 | 0 |
| 1246.0 | 0 |
| 1245.0 | 0 |
| 1244.0 | 0 |
| 1243.0 | 0 |
| 1242.0 | 0 |
| 1241.0 | 0 |
| 1240.0 | 0 |
| 1239.0 | 0 |
| 1238.0 | 0 |
| 1237.0 | 0 |
| 1236.0 | 0 |
| 1235.0 | 0 |
| 1234.0 | 0 |
| 1233.0 | 0 |
| 1232.0 | 0 |
| 1231.0 | 0 |
| 1230.0 | 0 |
| 1229.0 | 0 |
| 1228.0 | 0 |
| 1227.0 | 0 |
| 1226.0 | 0 |
| 1225.0 | 0 |
| 1224.0 | 0 |
| 1223.0 | 0 |
| 1222.0 | 0 |
| 1221.0 | 0 |
| 1220.0 | 0 |
| 1219.0 | 0 |
| 1218.0 | 0 |
| 1217.0 | 0 |
| 1216.0 | 0 |
| 1215.0 | 0 |
| 1214.0 | 0 |
| 1213.0 | 0 |
| 1212.0 | 0 |
| 1211.0 | 0 |
| 1210.0 | 0 |
| 1209.0 | 0 |
| 1208.0 | 0 |
| 1207.0 | 0 |
| 1206.0 | 0 |
| 1205.0 | 0 |
| 1204.0 | 0 |
| 1203.0 | 0 |
| 1202.0 | 0 |
| 1201.0 | 0 |
| 1200.0 | 0 |
| 1199.0 | 0 |
| 1198.0 | 0 |
| 1197.0 | 0 |
| 1196.0 | 0 |
| 1195.0 | 0 |
| 1194.0 | 0 |
| 1193.0 | 0 |
| 1192.0 | 0 |
| 1191.0 | 0 |
| 1190.0 | 0 |
| 1189.0 | 0 |
| 1188.0 | 0 |
| 1187.0 | 0 |
| 1186.0 | 0 |
| 1185.0 | 0 |
| 1184.0 | 0 |
| 1183.0 | 0 |
| 1182.0 | 0 |
| 1181.0 | 0 |
| 1180.0 | 0 |
| 1179.0 | 0 |
| 1178.0 | 0 |
| 1177.0 | 0 |
| 1176.0 | 0 |
| 1175.0 | 0 |
| 1174.0 | 0 |
| 1173.0 | 0 |
| 1172.0 | 0 |
| 1171.0 | 0 |
| 1170.0 | 0 |
| 1169.0 | 0 |
| 1168.0 | 0 |
| 1167.0 | 0 |
| 1166.0 | 0 |
| 1165.0 | 0 |
| 1164.0 | 0 |
| 1163.0 | 0 |
| 1162.0 | 0 |
| 1161.0 | 0 |
| 1160.0 | 0 |
| 1159.0 | 0 |
| 1158.0 | 0 |
| 1157.0 | 0 |
| 1156.0 | 0 |
| 1155.0 | 0 |
| 1154.0 | 0 |
| 1153.0 | 0 |
| 1152.0 | 0 |
| 1151.0 | 0 |
| 1150.0 | 0 |
| 1149.0 | 0 |
| 1148.0 | 0 |
| 1147.0 | 0 |
| 1146.0 | 0 |
| 1145.0 | 0 |
| 1144.0 | 0 |
| 1143.0 | 0 |
| 1142.0 | 0 |
| 1141.0 | 0 |
| 1140.0 | 0 |
| 1139.0 | 0 |
| 1138.0 | 0 |
| 1137.0 | 0 |
| 1136.0 | 0 |
| 1135.0 | 0 |
| 1134.0 | 0 |
| 1133.0 | 0 |
| 1132.0 | 0 |
| 1131.0 | 0 |
| 1130.0 | 0 |
| 1129.0 | 0 |
| 1128.0 | 0 |
| 1127.0 | 0 |
| 1126.0 | 0 |
| 1125.0 | 0 |
| 1124.0 | 0 |
| 1123.0 | 0 |
| 1122.0 | 0 |
| 1121.0 | 0 |
| 1120.0 | 0 |
| 1119.0 | 0 |
| 1118.0 | 0 |
| 1117.0 | 0 |
| 1116.0 | 0 |
| 1115.0 | 0 |
| 1114.0 | 0 |
| 1113.0 | 0 |
| 1112.0 | 0 |
| 1111.0 | 0 |
| 1110.0 | 0 |
| 1109.0 | 0 |
| 1108.0 | 0 |
| 1107.0 | 0 |
| 1106.0 | 0 |
| 1105.0 | 0 |
| 1104.0 | 0 |
| 1103.0 | 0 |
| 1102.0 | 0 |
| 1101.0 | 0 |
| 1100.0 | 0 |
| 1099.0 | 0 |
| 1098.0 | 0 |
| 1097.0 | 0 |
| 1096.0 | 0 |
| 1095.0 | 0 |
| 1094.0 | 0 |
| 1093.0 | 0 |
| 1092.0 | 0 |
| 1091.0 | 0 |
| 1090.0 | 0 |
| 1089.0 | 0 |
| 1088.0 | 0 |
| 1087.0 | 0 |
| 1086.0 | 0 |
| 1085.0 | 0 |
| 1084.0 | 0 |
| 1083.0 | 0 |
| 1082.0 | 0 |
| 1081.0 | 0 |
| 1080.0 | 0 |
| 1079.0 | 0 |
| 1078.0 | 0 |
| 1077.0 | 0 |
| 1076.0 | 0 |
| 1075.0 | 0 |
| 1074.0 | 0 |
| 1073.0 | 0 |
| 1072.0 | 0 |
| 1071.0 | 0 |
| 1070.0 | 0 |
| 1069.0 | 0 |
| 1068.0 | 0 |
| 1067.0 | 0 |
| 1066.0 | 0 |
| 1065.0 | 0 |
| 1064.0 | 0 |
| 1063.0 | 0 |
| 1062.0 | 0 |
| 1061.0 | 0 |
| 1060.0 | 0 |
| 1059.0 | 0 |
| 1058.0 | 0 |
| 1057.0 | 0 |
| 1056.0 | 0 |
| 1055.0 | 0 |
| 1054.0 | 0 |
| 1053.0 | 0 |
| 1052.0 | 0 |
| 1051.0 | 0 |
| 1050.0 | 0 |
| 1049.0 | 0 |
| 1048.0 | 0 |
| 1047.0 | 0 |
| 1046.0 | 0 |
| 1045.0 | 0 |
| 1044.0 | 0 |
| 1043.0 | 0 |
| 1042.0 | 0 |
| 1041.0 | 0 |
| 1040.0 | 0 |
| 1039.0 | 0 |
| 1038.0 | 0 |
| 1037.0 | 0 |
| 1036.0 | 0 |
| 1035.0 | 0 |
| 1034.0 | 0 |
| 1033.0 | 0 |
| 1032.0 | 0 |
| 1031.0 | 0 |
| 1030.0 | 0 |
| 1029.0 | 0 |
| 1028.0 | 0 |
| 1027.0 | 0 |
| 1026.0 | 0 |
| 1025.0 | 0 |
| 1024.0 | 0 |
| 1023.0 | 0 |
| 1022.0 | 0 |
| 1021.0 | 0 |
| 1020.0 | 0 |
| 1019.0 | 0 |
| 1018.0 | 0 |
| 1017.0 | 0 |
| 1016.0 | 0 |
| 1015.0 | 0 |
| 1014.0 | 0 |
| 1013.0 | 0 |
| 1012.0 | 0 |
| 1011.0 | 0 |
| 1010.0 | 0 |
| 1009.0 | 0 |
| 1008.0 | 0 |
| 1007.0 | 0 |
| 1006.0 | 0 |
| 1005.0 | 0 |
| 1004.0 | 0 |
| 1003.0 | 0 |
| 1002.0 | 0 |
| 1001.0 | 0 |
| 1000.0 | 0 |
| 999.0 | 0 |
| 998.0 | 0 |
| 997.0 | 0 |
| 996.0 | 0 |
| 995.0 | 0 |
| 994.0 | 0 |
| 993.0 | 0 |
| 992.0 | 0 |
| 991.0 | 0 |
| 990.0 | 0 |
| 989.0 | 0 |
| 988.0 | 0 |
| 987.0 | 0 |
| 986.0 | 0 |
| 985.0 | 0 |
| 984.0 | 0 |
| 983.0 | 0 |
| 982.0 | 0 |
| 981.0 | 0 |
| 980.0 | 0 |
| 979.0 | 0 |
| 978.0 | 0 |
| 977.0 | 0 |
| 976.0 | 0 |
| 975.0 | 0 |
| 974.0 | 0 |
| 973.0 | 0 |
| 972.0 | 0 |
| 971.0 | 0 |
| 970.0 | 0 |
| 969.0 | 0 |
| 968.0 | 0 |
| 967.0 | 0 |
| 966.0 | 0 |
| 965.0 | 0 |
| 964.0 | 0 |
| 963.0 | 0 |
| 962.0 | 0 |
| 961.0 | 0 |
| 960.0 | 0 |
| 959.0 | 0 |
| 958.0 | 0 |
| 957.0 | 0 |
| 956.0 | 0 |
| 955.0 | 0 |
| 954.0 | 0 |
| 953.0 | 0 |
| 952.0 | 0 |
| 951.0 | 0 |
| 950.0 | 0 |
| 949.0 | 0 |
| 948.0 | 0 |
| 947.0 | 0 |
| 946.0 | 0 |
| 945.0 | 0 |
| 944.0 | 0 |
| 943.0 | 0 |
| 942.0 | 0 |
| 941.0 | 0 |
| 940.0 | 0 |
| 939.0 | 0 |
| 938.0 | 0 |
| 937.0 | 0 |
| 936.0 | 0 |
| 935.0 | 0 |
| 934.0 | 0 |
| 933.0 | 0 |
| 932.0 | 0 |
| 931.0 | 0 |
| 930.0 | 0 |
| 929.0 | 0 |
| 928.0 | 0 |
| 927.0 | 0 |
| 926.0 | 0 |
| 925.0 | 0 |
| 924.0 | 0 |
| 923.0 | 0 |
| 922.0 | 0 |
| 921.0 | 0 |
| 920.0 | 0 |
| 919.0 | 0 |
| 918.0 | 0 |
| 917.0 | 0 |
| 916.0 | 0 |
| 915.0 | 0 |
| 914.0 | 0 |
| 913.0 | 0 |
| 912.0 | 0 |
| 911.0 | 0 |
| 910.0 | 0 |
| 909.0 | 0 |
| 908.0 | 0 |
| 907.0 | 0 |
| 906.0 | 0 |
| 905.0 | 0 |
| 904.0 | 0 |
| 903.0 | 0 |
| 902.0 | 0 |
| 901.0 | 0 |
| 900.0 | 0 |
| 899.0 | 0 |
| 898.0 | 0 |
| 897.0 | 0 |
| 896.0 | 0 |
| 895.0 | 0 |
| 894.0 | 0 |
| 893.0 | 0 |
| 892.0 | 0 |
| 891.0 | 0 |
| 890.0 | 0 |
| 889.0 | 0 |
| 888.0 | 0 |
| 887.0 | 0 |
| 886.0 | 0 |
| 885.0 | 0 |
| 884.0 | 0 |
| 883.0 | 0 |
| 882.0 | 0 |
| 881.0 | 0 |
| 880.0 | 0 |
| 879.0 | 0 |
| 878.0 | 0 |
| 877.0 | 0 |
| 876.0 | 0 |
| 875.0 | 0 |
| 874.0 | 0 |
| 873.0 | 0 |
| 872.0 | 0 |
| 871.0 | 0 |
| 870.0 | 0 |
| 869.0 | 0 |
| 868.0 | 0 |
| 867.0 | 0 |
| 866.0 | 0 |
| 865.0 | 0 |
| 864.0 | 0 |
| 863.0 | 0 |
| 862.0 | 0 |
| 861.0 | 0.001 |
| 860.0 | 0.001 |
| 859.0 | 0.001 |
| 858.0 | 0 |
| 857.0 | 0.001 |
| 856.0 | 0 |
| 855.0 | 0 |
| 854.0 | 0.001 |
| 853.0 | 0.001 |
| 852.0 | 0.001 |
| 851.0 | 0.001 |
| 850.0 | 0.001 |
| 849.0 | 0.001 |
| 848.0 | 0.001 |
| 847.0 | 0.001 |
| 846.0 | 0.001 |
| 845.0 | 0.001 |
| 844.0 | 0.001 |
| 843.0 | 0.001 |
| 842.0 | 0.001 |
| 841.0 | 0.001 |
| 840.0 | 0.001 |
| 839.0 | 0.001 |
| 838.0 | 0.001 |
| 837.0 | 0.001 |
| 836.0 | 0.001 |
| 835.0 | 0.001 |
| 834.0 | 0.001 |
| 833.0 | 0.001 |
| 832.0 | 0.001 |
| 831.0 | 0.001 |
| 830.0 | 0.001 |
| 829.0 | 0.001 |
| 828.0 | 0.001 |
| 827.0 | 0.001 |
| 826.0 | 0.001 |
| 825.0 | 0.001 |
| 824.0 | 0.001 |
| 823.0 | 0.001 |
| 822.0 | 0.001 |
| 821.0 | 0.001 |
| 820.0 | 0.001 |
| 819.0 | 0.002 |
| 818.0 | 0.001 |
| 817.0 | 0.002 |
| 816.0 | 0.001 |
| 815.0 | 0.002 |
| 814.0 | 0.001 |
| 813.0 | 0.001 |
| 812.0 | 0.002 |
| 811.0 | 0.002 |
| 810.0 | 0.002 |
| 809.0 | 0.002 |
| 808.0 | 0.002 |
| 807.0 | 0.002 |
| 806.0 | 0.002 |
| 805.0 | 0.002 |
| 804.0 | 0.002 |
| 803.0 | 0.002 |
| 802.0 | 0.002 |
| 801.0 | 0.002 |
| 800.0 | 0.002 |
| 799.0 | 0 |
| 798.0 | 0 |
| 797.0 | 0 |
| 796.0 | 0 |
| 795.0 | 0 |
| 794.0 | 0 |
| 793.0 | 0 |
| 792.0 | 0 |
| 791.0 | 0 |
| 790.0 | 0 |
| 789.0 | 0 |
| 788.0 | 0 |
| 787.0 | 0 |
| 786.0 | 0 |
| 785.0 | 0 |
| 784.0 | 0 |
| 783.0 | 0 |
| 782.0 | 0 |
| 781.0 | 0 |
| 780.0 | 0 |
| 779.0 | 0 |
| 778.0 | 0 |
| 777.0 | 0 |
| 776.0 | 0 |
| 775.0 | 0 |
| 774.0 | 0 |
| 773.0 | 0 |
| 772.0 | 0 |
| 771.0 | 0 |
| 770.0 | 0 |
| 769.0 | 0 |
| 768.0 | 0 |
| 767.0 | 0 |
| 766.0 | 0 |
| 765.0 | 0 |
| 764.0 | 0 |
| 763.0 | 0 |
| 762.0 | 0 |
| 761.0 | 0 |
| 760.0 | 0 |
| 759.0 | 0 |
| 758.0 | 0 |
| 757.0 | 0 |
| 756.0 | 0 |
| 755.0 | 0 |
| 754.0 | 0 |
| 753.0 | 0 |
| 752.0 | 0 |
| 751.0 | 0 |
| 750.0 | 0.001 |
| 749.0 | 0.001 |
| 748.0 | 0.001 |
| 747.0 | 0.001 |
| 746.0 | 0.001 |
| 745.0 | 0 |
| 744.0 | 0 |
| 743.0 | 0 |
| 742.0 | 0 |
| 741.0 | 0 |
| 740.0 | 0 |
| 739.0 | 0 |
| 738.0 | 0 |
| 737.0 | 0 |
| 736.0 | 0 |
| 735.0 | 0 |
| 734.0 | 0 |
| 733.0 | 0 |
| 732.0 | 0 |
| 731.0 | 0 |
| 730.0 | 0 |
| 729.0 | 0 |
| 728.0 | 0 |
| 727.0 | 0 |
| 726.0 | 0 |
| 725.0 | 0 |
| 724.0 | 0 |
| 723.0 | 0 |
| 722.0 | 0 |
| 721.0 | 0 |
| 720.0 | 0 |
| 719.0 | 0 |
| 718.0 | 0 |
| 717.0 | 0 |
| 716.0 | 0 |
| 715.0 | 0 |
| 714.0 | 0 |
| 713.0 | 0 |
| 712.0 | 0 |
| 711.0 | 0 |
| 710.0 | 0 |
| 709.0 | 0 |
| 708.0 | 0 |
| 707.0 | 0 |
| 706.0 | 0 |
| 705.0 | 0 |
| 704.0 | 0 |
| 703.0 | 0 |
| 702.0 | 0 |
| 701.0 | 0 |
| 700.0 | 0 |
| 699.0 | 0 |
| 698.0 | 0 |
| 697.0 | 0 |
| 696.0 | 0 |
| 695.0 | 0 |
| 694.0 | 0 |
| 693.0 | 0 |
| 692.0 | 0 |
| 691.0 | 0 |
| 690.0 | 0 |
| 689.0 | 0 |
| 688.0 | 0 |
| 687.0 | 0 |
| 686.0 | 0 |
| 685.0 | 0 |
| 684.0 | 0 |
| 683.0 | 0 |
| 682.0 | 0 |
| 681.0 | 0 |
| 680.0 | 0 |
| 679.0 | 0 |
| 678.0 | 0 |
| 677.0 | 0 |
| 676.0 | 0 |
| 675.0 | 0 |
| 674.0 | 0 |
| 673.0 | 0 |
| 672.0 | 0 |
| 671.0 | 0 |
| 670.0 | 0 |
| 669.0 | 0 |
| 668.0 | 0 |
| 667.0 | 0 |
| 666.0 | 0 |
| 665.0 | 0 |
| 664.0 | 0 |
| 663.0 | 0 |
| 662.0 | 0 |
| 661.0 | 0 |
| 660.0 | 0 |
| 659.0 | 0 |
| 658.0 | 0 |
| 657.0 | 0 |
| 656.0 | 0 |
| 655.0 | 0 |
| 654.0 | 0 |
| 653.0 | 0 |
| 652.0 | 0 |
| 651.0 | 0 |
| 650.0 | 0 |
| 649.0 | 0 |
| 648.0 | 0 |
| 647.0 | 0 |
| 646.0 | 0 |
| 645.0 | 0 |
| 644.0 | 0 |
| 643.0 | 0 |
| 642.0 | 0 |
| 641.0 | 0 |
| 640.0 | 0 |
| 639.0 | 0 |
| 638.0 | 0 |
| 637.0 | 0 |
| 636.0 | 0 |
| 635.0 | 0 |
| 634.0 | 0 |
| 633.0 | 0 |
| 632.0 | 0 |
| 631.0 | 0 |
| 630.0 | 0 |
| 629.0 | 0 |
| 628.0 | 0 |
| 627.0 | 0 |
| 626.0 | 0 |
| 625.0 | 0 |
| 624.0 | 0 |
| 623.0 | 0 |
| 622.0 | 0.001 |
| 621.0 | 0.001 |
| 620.0 | 0.001 |
| 619.0 | 0.001 |
| 618.0 | 0.001 |
| 617.0 | 0.001 |
| 616.0 | 0.002 |
| 615.0 | 0.002 |
| 614.0 | 0.003 |
| 613.0 | 0.004 |
| 612.0 | 0.005 |
| 611.0 | 0.006 |
| 610.0 | 0.008 |
| 609.0 | 0.011 |
| 608.0 | 0.015 |
| 607.0 | 0.022 |
| 606.0 | 0.031 |
| 605.0 | 0.046 |
| 604.0 | 0.07 |
| 603.0 | 0.111 |
| 602.0 | 0.184 |
| 601.0 | 0.325 |
| 600.0 | 0.616 |
| 599.0 | 1.265 |
| 598.0 | 2.872 |
| 597.0 | 7.076 |
| 596.0 | 15.732 |
| 595.0 | 31.495 |
| 594.0 | 45.401 |
| 593.0 | 52.899 |
| 592.0 | 55.127 |
| 591.0 | 55.905 |
| 590.0 | 56.428 |
| 589.0 | 56.587 |
| 588.0 | 55.13 |
| 587.0 | 47.958 |
| 586.0 | 33.344 |
| 585.0 | 17.571 |
| 584.0 | 7.47 |
| 583.0 | 2.989 |
| 582.0 | 1.279 |
| 581.0 | 0.604 |
| 580.0 | 0.308 |
| 579.0 | 0.168 |
| 578.0 | 0.097 |
| 577.0 | 0.058 |
| 576.0 | 0.037 |
| 575.0 | 0.024 |
| 574.0 | 0.016 |
| 573.0 | 0.011 |
| 572.0 | 0.008 |
| 571.0 | 0.005 |
| 570.0 | 0.004 |
| 569.0 | 0.003 |
| 568.0 | 0.002 |
| 567.0 | 0.002 |
| 566.0 | 0.001 |
| 565.0 | 0.001 |
| 564.0 | 0.001 |
| 563.0 | 0.001 |
| 562.0 | 0 |
| 561.0 | 0 |
| 560.0 | 0 |
| 559.0 | 0 |
| 558.0 | 0 |
| 557.0 | 0 |
| 556.0 | 0 |
| 555.0 | 0 |
| 554.0 | 0 |
| 553.0 | 0 |
| 552.0 | 0 |
| 551.0 | 0 |
| 550.0 | 0 |
| 549.0 | 0 |
| 548.0 | 0 |
| 547.0 | 0 |
| 546.0 | 0 |
| 545.0 | 0 |
| 544.0 | 0 |
| 543.0 | 0 |
| 542.0 | 0 |
| 541.0 | 0 |
| 540.0 | 0 |
| 539.0 | 0 |
| 538.0 | 0 |
| 537.0 | 0 |
| 536.0 | 0 |
| 535.0 | 0 |
| 534.0 | 0 |
| 533.0 | 0 |
| 532.0 | 0 |
| 531.0 | 0 |
| 530.0 | 0 |
| 529.0 | 0 |
| 528.0 | 0 |
| 527.0 | 0 |
| 526.0 | 0 |
| 525.0 | 0 |
| 524.0 | 0 |
| 523.0 | 0 |
| 522.0 | 0 |
| 521.0 | 0 |
| 520.0 | 0 |
| 519.0 | 0 |
| 518.0 | 0 |
| 517.0 | 0 |
| 516.0 | 0 |
| 515.0 | 0 |
| 514.0 | 0 |
| 513.0 | 0 |
| 512.0 | 0 |
| 511.0 | 0 |
| 510.0 | 0 |
| 509.0 | 0 |
| 508.0 | 0 |
| 507.0 | 0 |
| 506.0 | 0 |
| 505.0 | 0 |
| 504.0 | 0 |
| 503.0 | 0 |
| 502.0 | 0 |
| 501.0 | 0 |
| 500.0 | 0 |
| 499.0 | 0 |
| 498.0 | 0 |
| 497.0 | 0 |
| 496.0 | 0 |
| 495.0 | 0 |
| 494.0 | 0 |
| 493.0 | 0 |
| 492.0 | 0 |
| 491.0 | 0 |
| 490.0 | 0 |
| 489.0 | 0 |
| 488.0 | 0 |
| 487.0 | 0 |
| 486.0 | 0 |
| 485.0 | 0 |
| 484.0 | 0 |
| 483.0 | 0 |
| 482.0 | 0 |
| 481.0 | 0 |
| 480.0 | 0 |
| 479.0 | 0 |
| 478.0 | 0 |
| 477.0 | 0 |
| 476.0 | 0 |
| 475.0 | 0 |
| 474.0 | 0 |
| 473.0 | 0 |
| 472.0 | 0 |
| 471.0 | 0 |
| 470.0 | 0 |
| 469.0 | 0 |
| 468.0 | 0 |
| 467.0 | 0 |
| 466.0 | 0 |
| 465.0 | 0 |
| 464.0 | 0 |
| 463.0 | 0 |
| 462.0 | 0 |
| 461.0 | 0 |
| 460.0 | 0 |
| 459.0 | 0 |
| 458.0 | 0 |
| 457.0 | 0 |
| 456.0 | 0 |
| 455.0 | 0 |
| 454.0 | 0 |
| 453.0 | 0 |
| 452.0 | 0 |
| 451.0 | 0 |
| 450.0 | 0 |
| 449.0 | 0 |
| 448.0 | 0 |
| 447.0 | 0 |
| 446.0 | 0 |
| 445.0 | 0 |
| 444.0 | 0 |
| 443.0 | 0 |
| 442.0 | 0 |
| 441.0 | 0 |
| 440.0 | 0 |
| 439.0 | 0 |
| 438.0 | 0 |
| 437.0 | 0 |
| 436.0 | 0 |
| 435.0 | 0 |
| 434.0 | 0 |
| 433.0 | 0 |
| 432.0 | 0 |
| 431.0 | 0 |
| 430.0 | 0 |
| 429.0 | 0 |
| 428.0 | 0 |
| 427.0 | 0 |
| 426.0 | 0 |
| 425.0 | 0 |
| 424.0 | 0 |
| 423.0 | 0 |
| 422.0 | 0 |
| 421.0 | 0 |
| 420.0 | 0 |
| 419.0 | 0 |
| 418.0 | 0 |
| 417.0 | 0 |
| 416.0 | 0 |
| 415.0 | 0 |
| 414.0 | 0 |
| 413.0 | 0 |
| 412.0 | 0 |
| 411.0 | 0 |
| 410.0 | 0 |
| 409.0 | 0 |
| 408.0 | 0 |
| 407.0 | 0 |
| 406.0 | 0 |
| 405.0 | 0 |
| 404.0 | 0 |
| 403.0 | 0 |
| 402.0 | 0 |
| 401.0 | 0 |
| 400.0 | 0 |
| 399.0 | 0 |
| 398.0 | 0 |
| 397.0 | 0 |
| 396.0 | 0 |
| 395.0 | 0 |
| 394.0 | 0 |
| 393.0 | 0 |
| 392.0 | 0 |
| 391.0 | 0 |
| 390.0 | 0 |
| 389.0 | 0 |
| 388.0 | 0 |
| 387.0 | 0 |
| 386.0 | 0 |
| 385.0 | 0 |
| 384.0 | 0 |
| 383.0 | 0 |
| 382.0 | 0 |
| 381.0 | 0 |
| 380.0 | 0 |
| 379.0 | 0 |
| 378.0 | 0 |
| 377.0 | 0 |
| 376.0 | 0 |
| 375.0 | 0 |
| 374.0 | 0 |
| 373.0 | 0 |
| 372.0 | 0 |
| 371.0 | 0 |
| 370.0 | 0 |
| 369.0 | 0 |
| 368.0 | 0 |
| 367.0 | 0 |
| 366.0 | 0 |
| 365.0 | 0 |
| 364.0 | 0 |
| 363.0 | 0 |
| 362.0 | 0 |
| 361.0 | 0 |
| 360.0 | 0 |
| 359.0 | 0 |
| 358.0 | 0 |
| 357.0 | 0 |
| 356.0 | 0 |
| 355.0 | 0 |
| 354.0 | 0 |
| 353.0 | 0 |
| 352.0 | 0 |
| 351.0 | 0 |
| 350.0 | 0 |
| 349.0 | 0 |
| 348.0 | 0 |
| 347.0 | 0 |
| 346.0 | 0 |
| 345.0 | 0 |
| 344.0 | 0 |
| 343.0 | 0 |
| 342.0 | 0 |
| 341.0 | 0 |
| 340.0 | 0 |
| 339.0 | 0 |
| 338.0 | 0 |
| 337.0 | 0 |
| 336.0 | 0 |
| 335.0 | 0 |
| 334.0 | 0 |
| 333.0 | 0 |
| 332.0 | 0 |
| 331.0 | 0 |
| 330.0 | 0 |
| 329.0 | 0 |
| 328.0 | 0 |
| 327.0 | 0 |
| 326.0 | 0 |
| 325.0 | 0 |
| 324.0 | 0 |
| 323.0 | 0 |
| 322.0 | 0 |
| 321.0 | 0 |
| 320.0 | 0 |
| 319.0 | 0 |
| 318.0 | 0 |
| 317.0 | 0 |
| 316.0 | 0 |
| 315.0 | 0 |
| 314.0 | 0 |
| 313.0 | 0 |
| 312.0 | 0 |
| 311.0 | 0 |
| 310.0 | 0 |
| 309.0 | 0 |
| 308.0 | 0 |
| 307.0 | 0 |
| 306.0 | 0 |
| 305.0 | 0 |
| 304.0 | 0 |
| 303.0 | 0 |
| 302.0 | 0 |
| 301.0 | 0 |
| 300.0 | 0 |
| 299.0 | 0 |
| 298.0 | 0 |
| 297.0 | 0 |
| 296.0 | 0 |
| 295.0 | 0 |
| 294.0 | 0 |
| 293.0 | 0 |
| 292.0 | 0 |
| 291.0 | 0 |
| 290.0 | 0 |
| 289.0 | 0 |
| 288.0 | 0 |
| 287.0 | 0 |
| 286.0 | 0 |
| 285.0 | 0 |
| 284.0 | 0 |
| 283.0 | 0 |
| 282.0 | 0 |
| 281.0 | 0 |
| 280.0 | 0 |
| 279.0 | 0 |
| 278.0 | 0 |
| 277.0 | 0 |
| 276.0 | 0 |
| 275.0 | 0 |
| 274.0 | 0 |
| 273.0 | 0 |
| 272.0 | 0 |
| 271.0 | 0 |
| 270.0 | 0 |
| 269.0 | 0 |
| 268.0 | 0 |
| 267.0 | 0 |
| 266.0 | 0 |
| 265.0 | 0 |
| 264.0 | 0 |
| 263.0 | 0 |
| 262.0 | 0 |
| 261.0 | 0 |
| 260.0 | 0 |
| 259.0 | 0 |
| 258.0 | 0 |
| 257.0 | 0 |
| 256.0 | 0 |
| 255.0 | 0 |
| 254.0 | 0 |
| 253.0 | 0 |
| 252.0 | 0 |
| 251.0 | 0 |
| 250.0 | 0 |
| 249.0 | 0 |
| 248.0 | 0 |
| 247.0 | 0 |
| 246.0 | 0 |
| 245.0 | 0 |
| 244.0 | 0 |
| 243.0 | 0 |
| 242.0 | 0 |
| 241.0 | 0 |
| 240.0 | 0 |
| 239.0 | 0 |
| 238.0 | 0 |
| 237.0 | 0 |
| 236.0 | 0 |
| 235.0 | 0 |
| 234.0 | 0 |
| 233.0 | 0 |
| 232.0 | 0 |
| 231.0 | 0 |
| 230.0 | 0 |
| 229.0 | 0 |
| 228.0 | 0 |
| 227.0 | 0 |
| 226.0 | 0 |
| 225.0 | 0 |
| 224.0 | 0 |
| 223.0 | 0 |
| 222.0 | 0 |
| 221.0 | 0 |
| 220.0 | 0 |
| 219.0 | 0 |
| 218.0 | 0 |
| 217.0 | 0 |
| 216.0 | 0 |
| 215.0 | 0 |
| 214.0 | 0 |
| 213.0 | 0 |
| 212.0 | 0 |
| 211.0 | 0 |
| 210.0 | 0 |
| 209.0 | 0 |
| 208.0 | 0 |
| 207.0 | 0 |
| 206.0 | 0 |
| 205.0 | 0 |
| 204.0 | 0 |
| 203.0 | 0 |
| 202.0 | 0 |
| 201.0 | 0 |